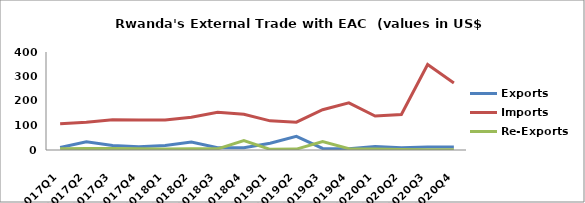
| Category | Exports | Imports | Re-Exports |
|---|---|---|---|
| 2017Q1 | 10.499 | 107 | 4.778 |
| 2017Q2 | 33.665 | 113.182 | 6.362 |
| 2017Q3 | 18.505 | 123.647 | 5.916 |
| 2017Q4 | 13.336 | 122.181 | 4.745 |
| 2018Q1 | 18.608 | 122.951 | 4.57 |
| 2018Q2 | 32.909 | 133.823 | 4.622 |
| 2018Q3 | 9.064 | 153.831 | 4.747 |
| 2018Q4 | 8.931 | 145.657 | 38.097 |
| 2019Q1 | 27.532 | 118.895 | 2.571 |
| 2019Q2 | 55.968 | 113.561 | 3.654 |
| 2019Q3 | 6.192 | 164.3 | 34.329 |
| 2019Q4 | 5.149 | 192.569 | 5.268 |
| 2020Q1 | 14.209 | 138.663 | 3.748 |
| 2020Q2 | 8.786 | 144.885 | 1.712 |
| 2020Q3 | 11.767 | 348.723 | 1.141 |
| 2020Q4 | 12.136 | 273.335 | 0.92 |